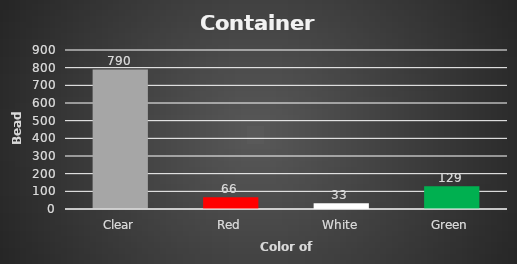
| Category | Total |
|---|---|
| Clear | 790 |
| Red | 66 |
| White | 33 |
| Green | 129 |